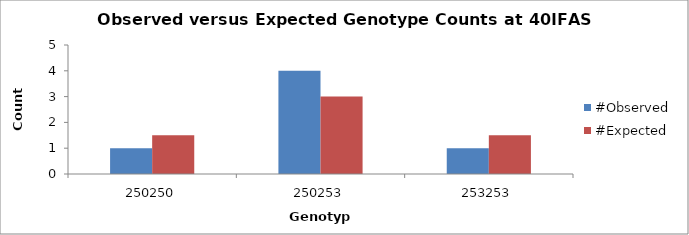
| Category | #Observed | #Expected |
|---|---|---|
| 250250.0 | 1 | 1.5 |
| 250253.0 | 4 | 3 |
| 253253.0 | 1 | 1.5 |